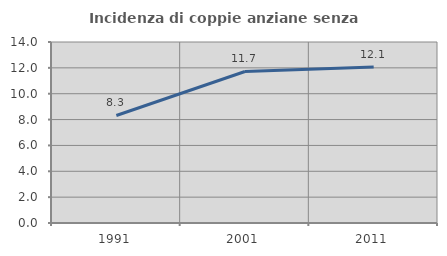
| Category | Incidenza di coppie anziane senza figli  |
|---|---|
| 1991.0 | 8.318 |
| 2001.0 | 11.72 |
| 2011.0 | 12.066 |